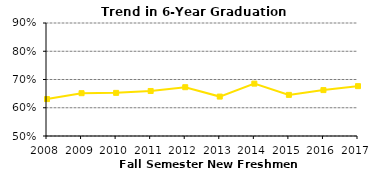
| Category | Series 1 |
|---|---|
| 2008.0 | 0.631 |
| 2009.0 | 0.652 |
| 2010.0 | 0.653 |
| 2011.0 | 0.659 |
| 2012.0 | 0.673 |
| 2013.0 | 0.64 |
| 2014.0 | 0.685 |
| 2015.0 | 0.646 |
| 2016.0 | 0.662 |
| 2017.0 | 0.676 |